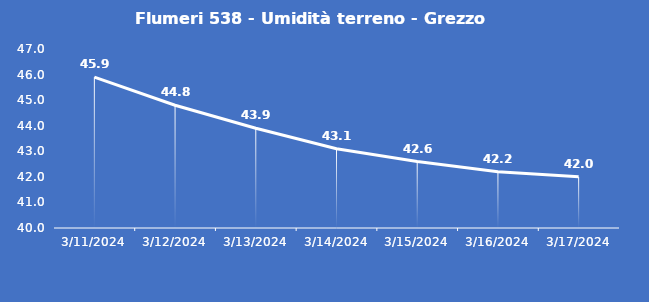
| Category | Flumeri 538 - Umidità terreno - Grezzo (%VWC) |
|---|---|
| 3/11/24 | 45.9 |
| 3/12/24 | 44.8 |
| 3/13/24 | 43.9 |
| 3/14/24 | 43.1 |
| 3/15/24 | 42.6 |
| 3/16/24 | 42.2 |
| 3/17/24 | 42 |